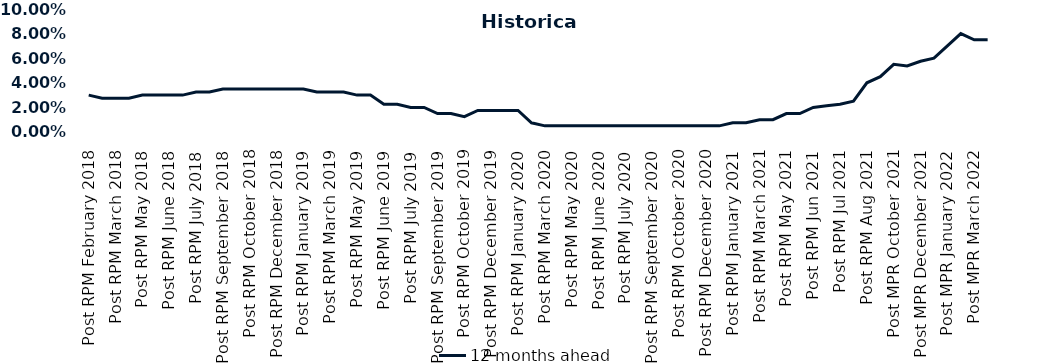
| Category | 12 months ahead |
|---|---|
| Post RPM February 2018 | 0.03 |
| Pre RPM March 2018 | 0.028 |
| Post RPM March 2018 | 0.028 |
| Pre RPM May 2018 | 0.028 |
| Post RPM May 2018 | 0.03 |
| Pre RPM June 2018 | 0.03 |
| Post RPM June 2018 | 0.03 |
| Pre RPM July 2018 | 0.03 |
| Post RPM July 2018 | 0.032 |
| Pre RPM September 2018 | 0.032 |
| Post RPM September 2018 | 0.035 |
| Pre RPM October 2018 | 0.035 |
| Post RPM October 2018 | 0.035 |
| Pre RPM December 2018 | 0.035 |
| Post RPM December 2018 | 0.035 |
| Pre RPM January 2019 | 0.035 |
| Post RPM January 2019 | 0.035 |
| Pre RPM March 2019 | 0.032 |
| Post RPM March 2019 | 0.032 |
| Pre RPM May 2019 | 0.032 |
| Post RPM May 2019 | 0.03 |
| Pre RPM June 2019 | 0.03 |
| Post RPM June 2019 | 0.022 |
| Pre RPM July 2019 | 0.022 |
| Post RPM July 2019 | 0.02 |
| Pre RPM September 2019 | 0.02 |
| Post RPM September 2019 | 0.015 |
| Pre RPM October 2019 | 0.015 |
| Post RPM October 2019 | 0.012 |
| Pre RPM December 2019 | 0.018 |
| Post RPM December 2019 | 0.018 |
| Pre RPM January 2020 | 0.018 |
| Post RPM January 2020 | 0.018 |
| Pre RPM March 2020 | 0.008 |
| Post RPM March 2020 | 0.005 |
| Pre RPM May 2020 | 0.005 |
| Post RPM May 2020 | 0.005 |
| Pre RPM June 2020 | 0.005 |
| Post RPM June 2020 | 0.005 |
| Pre RPM July 2020 | 0.005 |
| Post RPM July 2020 | 0.005 |
| Pre RPM September 2020 | 0.005 |
| Post RPM September 2020 | 0.005 |
| Pre RPM October 2020 | 0.005 |
| Post RPM October 2020 | 0.005 |
| Pre RPM December 2020 | 0.005 |
|  Post RPM December 2020 | 0.005 |
| Pre RPM January 2021 | 0.005 |
| Post RPM January 2021 | 0.008 |
|  Pre RPM March 2021 | 0.008 |
|  Post RPM March 2021 | 0.01 |
|  Pre RPM May 2021 | 0.01 |
|  Post RPM May 2021 | 0.015 |
|  Pre RPM Jun 2021 | 0.015 |
|   Post RPM Jun 2021 | 0.02 |
| Pre RPM Jul 2021 | 0.021 |
|  Post RPM Jul 2021 | 0.022 |
| Pre RPM Aug 2021 | 0.025 |
|  Post RPM Aug 2021 | 0.04 |
| Pre MPR October 2021 | 0.045 |
| Post MPR October 2021 | 0.055 |
| Pre MPR December 2021 | 0.054 |
| Post MPR December 2021 | 0.058 |
| Pre MPR January 2022 | 0.06 |
| Post MPR January 2022 | 0.07 |
| Pre MPR March 2022 | 0.08 |
| Post MPR March 2022 | 0.075 |
| Pre MPR May 2022 | 0.075 |